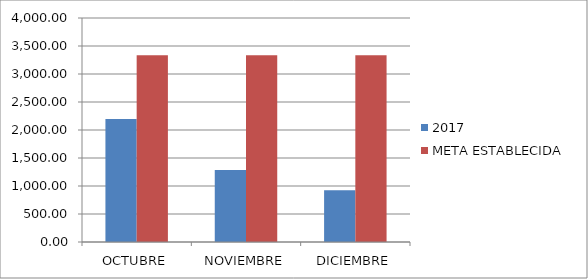
| Category | 2017 | META ESTABLECIDA  |
|---|---|---|
| OCTUBRE | 2194.76 | 3333.34 |
| NOVIEMBRE | 1287.54 | 3333.34 |
| DICIEMBRE | 922.7 | 3333.34 |